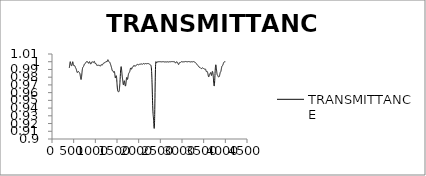
| Category | TRANSMITTANCE |
|---|---|
| 3999.640137 | 1 |
| 3997.71167 | 1 |
| 3995.783203 | 1 |
| 3993.854736 | 1 |
| 3991.92627 | 1 |
| 3989.997803 | 1 |
| 3988.069336 | 1 |
| 3986.140869 | 1 |
| 3984.212402 | 1 |
| 3982.283936 | 1 |
| 3980.355469 | 1 |
| 3978.427002 | 1 |
| 3976.498535 | 1 |
| 3974.570068 | 1 |
| 3972.641602 | 1 |
| 3970.713135 | 1 |
| 3968.784668 | 0.999 |
| 3966.856201 | 0.999 |
| 3964.927734 | 0.999 |
| 3962.999268 | 0.999 |
| 3961.070801 | 0.999 |
| 3959.142334 | 0.998 |
| 3957.213867 | 0.998 |
| 3955.2854 | 0.998 |
| 3953.356934 | 0.997 |
| 3951.428467 | 0.997 |
| 3949.5 | 0.997 |
| 3947.571533 | 0.997 |
| 3945.643066 | 0.996 |
| 3943.7146 | 0.996 |
| 3941.786133 | 0.996 |
| 3939.857666 | 0.995 |
| 3937.929199 | 0.995 |
| 3936.000732 | 0.995 |
| 3934.072266 | 0.995 |
| 3932.143799 | 0.995 |
| 3930.215332 | 0.995 |
| 3928.286865 | 0.995 |
| 3926.358398 | 0.995 |
| 3924.429932 | 0.994 |
| 3922.501465 | 0.994 |
| 3920.572998 | 0.994 |
| 3918.644531 | 0.994 |
| 3916.716064 | 0.993 |
| 3914.787598 | 0.993 |
| 3912.859131 | 0.992 |
| 3910.930664 | 0.992 |
| 3909.002197 | 0.991 |
| 3907.07373 | 0.99 |
| 3905.145264 | 0.99 |
| 3903.216797 | 0.989 |
| 3901.28833 | 0.989 |
| 3899.359863 | 0.988 |
| 3897.431396 | 0.988 |
| 3895.50293 | 0.987 |
| 3893.574463 | 0.987 |
| 3891.645996 | 0.987 |
| 3889.717529 | 0.987 |
| 3887.789063 | 0.987 |
| 3885.860596 | 0.987 |
| 3883.932129 | 0.986 |
| 3882.003662 | 0.986 |
| 3880.075195 | 0.986 |
| 3878.146729 | 0.985 |
| 3876.218262 | 0.985 |
| 3874.289795 | 0.984 |
| 3872.361328 | 0.984 |
| 3870.432861 | 0.983 |
| 3868.504395 | 0.982 |
| 3866.575928 | 0.982 |
| 3864.647461 | 0.981 |
| 3862.718994 | 0.981 |
| 3860.790527 | 0.981 |
| 3858.862061 | 0.981 |
| 3856.933594 | 0.981 |
| 3855.005127 | 0.98 |
| 3853.07666 | 0.98 |
| 3851.148193 | 0.98 |
| 3849.219727 | 0.98 |
| 3847.29126 | 0.98 |
| 3845.362793 | 0.98 |
| 3843.434326 | 0.98 |
| 3841.505859 | 0.98 |
| 3839.577393 | 0.981 |
| 3837.648926 | 0.981 |
| 3835.720459 | 0.981 |
| 3833.791992 | 0.981 |
| 3831.863525 | 0.981 |
| 3829.935059 | 0.981 |
| 3828.006592 | 0.981 |
| 3826.078125 | 0.982 |
| 3824.149658 | 0.982 |
| 3822.221191 | 0.982 |
| 3820.292725 | 0.983 |
| 3818.364258 | 0.983 |
| 3816.435791 | 0.983 |
| 3814.507324 | 0.983 |
| 3812.578857 | 0.983 |
| 3810.650391 | 0.984 |
| 3808.721924 | 0.984 |
| 3806.793457 | 0.985 |
| 3804.86499 | 0.986 |
| 3802.936523 | 0.986 |
| 3801.008057 | 0.987 |
| 3799.07959 | 0.988 |
| 3797.151123 | 0.989 |
| 3795.222656 | 0.99 |
| 3793.294189 | 0.991 |
| 3791.365723 | 0.992 |
| 3789.437256 | 0.994 |
| 3787.508789 | 0.994 |
| 3785.580322 | 0.995 |
| 3783.651855 | 0.996 |
| 3781.723389 | 0.996 |
| 3779.794922 | 0.996 |
| 3777.866455 | 0.996 |
| 3775.937988 | 0.995 |
| 3774.009521 | 0.994 |
| 3772.081055 | 0.993 |
| 3770.152588 | 0.992 |
| 3768.224121 | 0.991 |
| 3766.295654 | 0.989 |
| 3764.367188 | 0.987 |
| 3762.438721 | 0.985 |
| 3760.510254 | 0.982 |
| 3758.581787 | 0.98 |
| 3756.65332 | 0.978 |
| 3754.724854 | 0.976 |
| 3752.796387 | 0.974 |
| 3750.86792 | 0.972 |
| 3748.939453 | 0.971 |
| 3747.010986 | 0.97 |
| 3745.08252 | 0.969 |
| 3743.154053 | 0.969 |
| 3741.225586 | 0.969 |
| 3739.297119 | 0.969 |
| 3737.368652 | 0.97 |
| 3735.440186 | 0.971 |
| 3733.511719 | 0.972 |
| 3731.583252 | 0.974 |
| 3729.654785 | 0.975 |
| 3727.726318 | 0.977 |
| 3725.797852 | 0.978 |
| 3723.869385 | 0.979 |
| 3721.940918 | 0.981 |
| 3720.012451 | 0.982 |
| 3718.083984 | 0.983 |
| 3716.155518 | 0.984 |
| 3714.227051 | 0.985 |
| 3712.298584 | 0.986 |
| 3710.370117 | 0.986 |
| 3708.44165 | 0.987 |
| 3706.513184 | 0.987 |
| 3704.584717 | 0.987 |
| 3702.65625 | 0.988 |
| 3700.727783 | 0.987 |
| 3698.799316 | 0.987 |
| 3696.87085 | 0.987 |
| 3694.942383 | 0.986 |
| 3693.013916 | 0.986 |
| 3691.085449 | 0.985 |
| 3689.156982 | 0.984 |
| 3687.228516 | 0.984 |
| 3685.300049 | 0.983 |
| 3683.371582 | 0.983 |
| 3681.443115 | 0.982 |
| 3679.514648 | 0.982 |
| 3677.586182 | 0.982 |
| 3675.657715 | 0.983 |
| 3673.729248 | 0.983 |
| 3671.800781 | 0.984 |
| 3669.872314 | 0.984 |
| 3667.943848 | 0.985 |
| 3666.015381 | 0.985 |
| 3664.086914 | 0.986 |
| 3662.158447 | 0.986 |
| 3660.22998 | 0.986 |
| 3658.301514 | 0.986 |
| 3656.373047 | 0.986 |
| 3654.44458 | 0.986 |
| 3652.516113 | 0.985 |
| 3650.587646 | 0.985 |
| 3648.65918 | 0.985 |
| 3646.730713 | 0.985 |
| 3644.802246 | 0.984 |
| 3642.873779 | 0.984 |
| 3640.945313 | 0.984 |
| 3639.016846 | 0.984 |
| 3637.088379 | 0.984 |
| 3635.159912 | 0.984 |
| 3633.231445 | 0.983 |
| 3631.302979 | 0.983 |
| 3629.374512 | 0.983 |
| 3627.446045 | 0.982 |
| 3625.517578 | 0.982 |
| 3623.589111 | 0.981 |
| 3621.660645 | 0.981 |
| 3619.732178 | 0.981 |
| 3617.803711 | 0.98 |
| 3615.875244 | 0.98 |
| 3613.946777 | 0.981 |
| 3612.018311 | 0.981 |
| 3610.089844 | 0.981 |
| 3608.161377 | 0.982 |
| 3606.23291 | 0.982 |
| 3604.304443 | 0.983 |
| 3602.375977 | 0.983 |
| 3600.44751 | 0.984 |
| 3598.519043 | 0.984 |
| 3596.590576 | 0.985 |
| 3594.662109 | 0.985 |
| 3592.733643 | 0.986 |
| 3590.805176 | 0.986 |
| 3588.876709 | 0.987 |
| 3586.948242 | 0.987 |
| 3585.019775 | 0.987 |
| 3583.091309 | 0.987 |
| 3581.162842 | 0.987 |
| 3579.234375 | 0.988 |
| 3577.305908 | 0.988 |
| 3575.377441 | 0.987 |
| 3573.448975 | 0.987 |
| 3571.520508 | 0.987 |
| 3569.592041 | 0.987 |
| 3567.663574 | 0.987 |
| 3565.735107 | 0.987 |
| 3563.806641 | 0.987 |
| 3561.878174 | 0.987 |
| 3559.949707 | 0.987 |
| 3558.02124 | 0.988 |
| 3556.092773 | 0.988 |
| 3554.164307 | 0.988 |
| 3552.23584 | 0.989 |
| 3550.307373 | 0.989 |
| 3548.378906 | 0.99 |
| 3546.450439 | 0.99 |
| 3544.521973 | 0.99 |
| 3542.593506 | 0.99 |
| 3540.665039 | 0.99 |
| 3538.736572 | 0.991 |
| 3536.808105 | 0.991 |
| 3534.879639 | 0.991 |
| 3532.951172 | 0.991 |
| 3531.022705 | 0.991 |
| 3529.094238 | 0.991 |
| 3527.165771 | 0.991 |
| 3525.237305 | 0.991 |
| 3523.308838 | 0.991 |
| 3521.380371 | 0.991 |
| 3519.451904 | 0.991 |
| 3517.523438 | 0.991 |
| 3515.594971 | 0.991 |
| 3513.666504 | 0.991 |
| 3511.738037 | 0.991 |
| 3509.80957 | 0.991 |
| 3507.881104 | 0.991 |
| 3505.952637 | 0.991 |
| 3504.02417 | 0.991 |
| 3502.095703 | 0.991 |
| 3500.167236 | 0.991 |
| 3498.23877 | 0.991 |
| 3496.310303 | 0.991 |
| 3494.381836 | 0.991 |
| 3492.453369 | 0.991 |
| 3490.524902 | 0.991 |
| 3488.596436 | 0.991 |
| 3486.667969 | 0.992 |
| 3484.739502 | 0.992 |
| 3482.811035 | 0.992 |
| 3480.882568 | 0.992 |
| 3478.954102 | 0.992 |
| 3477.025635 | 0.992 |
| 3475.097168 | 0.992 |
| 3473.168701 | 0.992 |
| 3471.240234 | 0.992 |
| 3469.311768 | 0.992 |
| 3467.383301 | 0.992 |
| 3465.454834 | 0.992 |
| 3463.526367 | 0.992 |
| 3461.5979 | 0.992 |
| 3459.669434 | 0.992 |
| 3457.740967 | 0.992 |
| 3455.8125 | 0.992 |
| 3453.884033 | 0.991 |
| 3451.955566 | 0.991 |
| 3450.0271 | 0.991 |
| 3448.098633 | 0.991 |
| 3446.170166 | 0.991 |
| 3444.241699 | 0.991 |
| 3442.313232 | 0.991 |
| 3440.384766 | 0.991 |
| 3438.456299 | 0.991 |
| 3436.527832 | 0.991 |
| 3434.599365 | 0.991 |
| 3432.670898 | 0.992 |
| 3430.742432 | 0.992 |
| 3428.813965 | 0.992 |
| 3426.885498 | 0.992 |
| 3424.957031 | 0.992 |
| 3423.028564 | 0.992 |
| 3421.100098 | 0.992 |
| 3419.171631 | 0.993 |
| 3417.243164 | 0.993 |
| 3415.314697 | 0.993 |
| 3413.38623 | 0.993 |
| 3411.457764 | 0.993 |
| 3409.529297 | 0.993 |
| 3407.60083 | 0.993 |
| 3405.672363 | 0.993 |
| 3403.743896 | 0.993 |
| 3401.81543 | 0.993 |
| 3399.886963 | 0.993 |
| 3397.958496 | 0.993 |
| 3396.030029 | 0.993 |
| 3394.101563 | 0.993 |
| 3392.173096 | 0.993 |
| 3390.244629 | 0.993 |
| 3388.316162 | 0.993 |
| 3386.387695 | 0.993 |
| 3384.459229 | 0.994 |
| 3382.530762 | 0.994 |
| 3380.602295 | 0.994 |
| 3378.673828 | 0.994 |
| 3376.745361 | 0.994 |
| 3374.816895 | 0.995 |
| 3372.888428 | 0.995 |
| 3370.959961 | 0.995 |
| 3369.031494 | 0.995 |
| 3367.103027 | 0.995 |
| 3365.174561 | 0.995 |
| 3363.246094 | 0.995 |
| 3361.317627 | 0.995 |
| 3359.38916 | 0.996 |
| 3357.460693 | 0.996 |
| 3355.532227 | 0.996 |
| 3353.60376 | 0.996 |
| 3351.675293 | 0.996 |
| 3349.746826 | 0.996 |
| 3347.818359 | 0.996 |
| 3345.889893 | 0.996 |
| 3343.961426 | 0.997 |
| 3342.032959 | 0.997 |
| 3340.104492 | 0.997 |
| 3338.176025 | 0.997 |
| 3336.247559 | 0.997 |
| 3334.319092 | 0.997 |
| 3332.390625 | 0.997 |
| 3330.462158 | 0.998 |
| 3328.533691 | 0.998 |
| 3326.605225 | 0.998 |
| 3324.676758 | 0.998 |
| 3322.748291 | 0.998 |
| 3320.819824 | 0.998 |
| 3318.891357 | 0.998 |
| 3316.962891 | 0.999 |
| 3315.034424 | 0.999 |
| 3313.105957 | 0.999 |
| 3311.17749 | 0.999 |
| 3309.249023 | 0.999 |
| 3307.320557 | 0.999 |
| 3305.39209 | 0.999 |
| 3303.463623 | 0.999 |
| 3301.535156 | 0.999 |
| 3299.606689 | 0.999 |
| 3297.678223 | 0.999 |
| 3295.749756 | 1 |
| 3293.821289 | 1 |
| 3291.892822 | 1 |
| 3289.964355 | 1 |
| 3288.035889 | 1 |
| 3286.107422 | 1 |
| 3284.178955 | 1 |
| 3282.250488 | 1 |
| 3280.322021 | 1 |
| 3278.393555 | 1 |
| 3276.465088 | 1 |
| 3274.536621 | 1 |
| 3272.608154 | 1 |
| 3270.679688 | 1 |
| 3268.751221 | 1 |
| 3266.822754 | 1 |
| 3264.894287 | 1 |
| 3262.96582 | 1 |
| 3261.037354 | 1 |
| 3259.108887 | 1 |
| 3257.18042 | 1 |
| 3255.251953 | 1 |
| 3253.323486 | 1 |
| 3251.39502 | 1 |
| 3249.466553 | 1 |
| 3247.538086 | 1 |
| 3245.609619 | 1 |
| 3243.681152 | 1 |
| 3241.752686 | 1 |
| 3239.824219 | 1 |
| 3237.895752 | 1 |
| 3235.967285 | 1 |
| 3234.038818 | 1 |
| 3232.110352 | 1 |
| 3230.181885 | 1 |
| 3228.253418 | 1 |
| 3226.324951 | 1 |
| 3224.396484 | 1 |
| 3222.468018 | 1 |
| 3220.539551 | 1 |
| 3218.611084 | 1 |
| 3216.682617 | 1 |
| 3214.75415 | 1 |
| 3212.825684 | 1 |
| 3210.897217 | 1 |
| 3208.96875 | 1 |
| 3207.040283 | 1 |
| 3205.111816 | 1 |
| 3203.18335 | 1 |
| 3201.254883 | 1 |
| 3199.326416 | 1 |
| 3197.397949 | 1 |
| 3195.469482 | 1 |
| 3193.541016 | 1 |
| 3191.612549 | 1 |
| 3189.684082 | 1 |
| 3187.755615 | 1 |
| 3185.827148 | 1 |
| 3183.898682 | 1 |
| 3181.970215 | 1 |
| 3180.041748 | 1 |
| 3178.113281 | 1 |
| 3176.184814 | 1 |
| 3174.256348 | 1 |
| 3172.327881 | 1 |
| 3170.399414 | 1 |
| 3168.470947 | 1 |
| 3166.54248 | 1 |
| 3164.614014 | 1 |
| 3162.685547 | 1 |
| 3160.75708 | 1 |
| 3158.828613 | 1 |
| 3156.900146 | 1 |
| 3154.97168 | 1 |
| 3153.043213 | 1 |
| 3151.114746 | 1 |
| 3149.186279 | 1 |
| 3147.257813 | 1 |
| 3145.329346 | 1 |
| 3143.400879 | 1 |
| 3141.472412 | 1 |
| 3139.543945 | 1 |
| 3137.615479 | 1 |
| 3135.687012 | 1 |
| 3133.758545 | 1 |
| 3131.830078 | 1 |
| 3129.901611 | 1 |
| 3127.973145 | 1 |
| 3126.044678 | 1 |
| 3124.116211 | 1 |
| 3122.187744 | 1 |
| 3120.259277 | 1 |
| 3118.330811 | 1 |
| 3116.402344 | 1 |
| 3114.473877 | 1 |
| 3112.54541 | 1 |
| 3110.616943 | 1 |
| 3108.688477 | 1 |
| 3106.76001 | 1 |
| 3104.831543 | 1 |
| 3102.903076 | 1 |
| 3100.974609 | 1 |
| 3099.046143 | 1 |
| 3097.117676 | 1 |
| 3095.189209 | 1 |
| 3093.260742 | 1 |
| 3091.332275 | 1 |
| 3089.403809 | 1 |
| 3087.475342 | 1 |
| 3085.546875 | 1 |
| 3083.618408 | 1 |
| 3081.689941 | 1 |
| 3079.761475 | 1 |
| 3077.833008 | 1 |
| 3075.904541 | 1 |
| 3073.976074 | 1 |
| 3072.047607 | 1 |
| 3070.119141 | 1 |
| 3068.190674 | 1 |
| 3066.262207 | 1 |
| 3064.33374 | 1 |
| 3062.405273 | 1 |
| 3060.476807 | 1 |
| 3058.54834 | 1 |
| 3056.619873 | 1 |
| 3054.691406 | 1 |
| 3052.762939 | 1 |
| 3050.834473 | 1 |
| 3048.906006 | 1 |
| 3046.977539 | 1 |
| 3045.049072 | 1 |
| 3043.120605 | 1 |
| 3041.192139 | 1 |
| 3039.263672 | 1 |
| 3037.335205 | 1 |
| 3035.406738 | 1 |
| 3033.478271 | 1 |
| 3031.549805 | 1 |
| 3029.621338 | 1 |
| 3027.692871 | 1 |
| 3025.764404 | 1 |
| 3023.835938 | 1 |
| 3021.907471 | 1 |
| 3019.979004 | 1 |
| 3018.050537 | 1 |
| 3016.12207 | 1 |
| 3014.193604 | 1 |
| 3012.265137 | 1 |
| 3010.33667 | 1 |
| 3008.408203 | 1 |
| 3006.479736 | 1 |
| 3004.55127 | 1 |
| 3002.622803 | 1 |
| 3000.694336 | 1 |
| 2998.765869 | 1 |
| 2996.837402 | 1 |
| 2994.908936 | 1 |
| 2992.980469 | 1 |
| 2991.052002 | 1 |
| 2989.123535 | 1 |
| 2987.195068 | 1 |
| 2985.266602 | 1 |
| 2983.338135 | 1 |
| 2981.409668 | 1 |
| 2979.481201 | 1 |
| 2977.552734 | 1 |
| 2975.624268 | 1 |
| 2973.695801 | 1 |
| 2971.767334 | 0.999 |
| 2969.838867 | 0.999 |
| 2967.9104 | 0.999 |
| 2965.981934 | 0.999 |
| 2964.053467 | 0.999 |
| 2962.125 | 0.999 |
| 2960.196533 | 0.999 |
| 2958.268066 | 0.999 |
| 2956.3396 | 0.999 |
| 2954.411133 | 0.999 |
| 2952.482666 | 0.999 |
| 2950.554199 | 0.999 |
| 2948.625732 | 0.999 |
| 2946.697266 | 0.999 |
| 2944.768799 | 0.999 |
| 2942.840332 | 0.999 |
| 2940.911865 | 0.999 |
| 2938.983398 | 0.998 |
| 2937.054932 | 0.998 |
| 2935.126465 | 0.998 |
| 2933.197998 | 0.998 |
| 2931.269531 | 0.997 |
| 2929.341064 | 0.997 |
| 2927.412598 | 0.997 |
| 2925.484131 | 0.997 |
| 2923.555664 | 0.996 |
| 2921.627197 | 0.996 |
| 2919.69873 | 0.996 |
| 2917.770264 | 0.996 |
| 2915.841797 | 0.997 |
| 2913.91333 | 0.997 |
| 2911.984863 | 0.997 |
| 2910.056396 | 0.997 |
| 2908.12793 | 0.998 |
| 2906.199463 | 0.998 |
| 2904.270996 | 0.998 |
| 2902.342529 | 0.998 |
| 2900.414063 | 0.999 |
| 2898.485596 | 0.999 |
| 2896.557129 | 0.999 |
| 2894.628662 | 0.999 |
| 2892.700195 | 0.999 |
| 2890.771729 | 1 |
| 2888.843262 | 1 |
| 2886.914795 | 1 |
| 2884.986328 | 1 |
| 2883.057861 | 1 |
| 2881.129395 | 1 |
| 2879.200928 | 1 |
| 2877.272461 | 1 |
| 2875.343994 | 1 |
| 2873.415527 | 1 |
| 2871.487061 | 1 |
| 2869.558594 | 1 |
| 2867.630127 | 0.999 |
| 2865.70166 | 0.999 |
| 2863.773193 | 0.999 |
| 2861.844727 | 0.999 |
| 2859.91626 | 0.999 |
| 2857.987793 | 0.998 |
| 2856.059326 | 0.998 |
| 2854.130859 | 0.998 |
| 2852.202393 | 0.998 |
| 2850.273926 | 0.998 |
| 2848.345459 | 0.998 |
| 2846.416992 | 0.998 |
| 2844.488525 | 0.999 |
| 2842.560059 | 0.999 |
| 2840.631592 | 0.999 |
| 2838.703125 | 0.999 |
| 2836.774658 | 0.999 |
| 2834.846191 | 1 |
| 2832.917725 | 1 |
| 2830.989258 | 1 |
| 2829.060791 | 1 |
| 2827.132324 | 1 |
| 2825.203857 | 1 |
| 2823.275391 | 1 |
| 2821.346924 | 1 |
| 2819.418457 | 1 |
| 2817.48999 | 1 |
| 2815.561523 | 1 |
| 2813.633057 | 1 |
| 2811.70459 | 1 |
| 2809.776123 | 1 |
| 2807.847656 | 1 |
| 2805.919189 | 1 |
| 2803.990723 | 1 |
| 2802.062256 | 1 |
| 2800.133789 | 1 |
| 2798.205322 | 1 |
| 2796.276855 | 1 |
| 2794.348389 | 1 |
| 2792.419922 | 1 |
| 2790.491455 | 1 |
| 2788.562988 | 1 |
| 2786.634521 | 1 |
| 2784.706055 | 1 |
| 2782.777588 | 1 |
| 2780.849121 | 1 |
| 2778.920654 | 1 |
| 2776.992188 | 1 |
| 2775.063721 | 1 |
| 2773.135254 | 1 |
| 2771.206787 | 1 |
| 2769.27832 | 1 |
| 2767.349854 | 1 |
| 2765.421387 | 1 |
| 2763.49292 | 1 |
| 2761.564453 | 1 |
| 2759.635986 | 1 |
| 2757.70752 | 1 |
| 2755.779053 | 1 |
| 2753.850586 | 1 |
| 2751.922119 | 1 |
| 2749.993652 | 1 |
| 2748.065186 | 1 |
| 2746.136719 | 1 |
| 2744.208252 | 1 |
| 2742.279785 | 1 |
| 2740.351318 | 1 |
| 2738.422852 | 1 |
| 2736.494385 | 1 |
| 2734.565918 | 1 |
| 2732.637451 | 1 |
| 2730.708984 | 1 |
| 2728.780518 | 1 |
| 2726.852051 | 1 |
| 2724.923584 | 1 |
| 2722.995117 | 1 |
| 2721.06665 | 1 |
| 2719.138184 | 1 |
| 2717.209717 | 1 |
| 2715.28125 | 1 |
| 2713.352783 | 1 |
| 2711.424316 | 1 |
| 2709.49585 | 1 |
| 2707.567383 | 1 |
| 2705.638916 | 1 |
| 2703.710449 | 1 |
| 2701.781982 | 1 |
| 2699.853516 | 1 |
| 2697.925049 | 1 |
| 2695.996582 | 1 |
| 2694.068115 | 1 |
| 2692.139648 | 1 |
| 2690.211182 | 1 |
| 2688.282715 | 1 |
| 2686.354248 | 1 |
| 2684.425781 | 1 |
| 2682.497314 | 1 |
| 2680.568848 | 1 |
| 2678.640381 | 1 |
| 2676.711914 | 1 |
| 2674.783447 | 1 |
| 2672.85498 | 1 |
| 2670.926514 | 1 |
| 2668.998047 | 1 |
| 2667.06958 | 1 |
| 2665.141113 | 1 |
| 2663.212646 | 1 |
| 2661.28418 | 1 |
| 2659.355713 | 1 |
| 2657.427246 | 1 |
| 2655.498779 | 1 |
| 2653.570313 | 1 |
| 2651.641846 | 1 |
| 2649.713379 | 1 |
| 2647.784912 | 1 |
| 2645.856445 | 1 |
| 2643.927979 | 1 |
| 2641.999512 | 1 |
| 2640.071045 | 1 |
| 2638.142578 | 1 |
| 2636.214111 | 1 |
| 2634.285645 | 1 |
| 2632.357178 | 1 |
| 2630.428711 | 1 |
| 2628.500244 | 1 |
| 2626.571777 | 1 |
| 2624.643311 | 1 |
| 2622.714844 | 1 |
| 2620.786377 | 1 |
| 2618.85791 | 1 |
| 2616.929443 | 1 |
| 2615.000977 | 1 |
| 2613.07251 | 1 |
| 2611.144043 | 1 |
| 2609.215576 | 1 |
| 2607.287109 | 1 |
| 2605.358643 | 1 |
| 2603.430176 | 1 |
| 2601.501709 | 1 |
| 2599.573242 | 1 |
| 2597.644775 | 1 |
| 2595.716309 | 1 |
| 2593.787842 | 1 |
| 2591.859375 | 1 |
| 2589.930908 | 1 |
| 2588.002441 | 1 |
| 2586.073975 | 1 |
| 2584.145508 | 1 |
| 2582.217041 | 1 |
| 2580.288574 | 1 |
| 2578.360107 | 1 |
| 2576.431641 | 1 |
| 2574.503174 | 1 |
| 2572.574707 | 1 |
| 2570.64624 | 1 |
| 2568.717773 | 1 |
| 2566.789307 | 1 |
| 2564.86084 | 1 |
| 2562.932373 | 1 |
| 2561.003906 | 1 |
| 2559.075439 | 1 |
| 2557.146973 | 1 |
| 2555.218506 | 1 |
| 2553.290039 | 1 |
| 2551.361572 | 1 |
| 2549.433105 | 1 |
| 2547.504639 | 1 |
| 2545.576172 | 1 |
| 2543.647705 | 1 |
| 2541.719238 | 1 |
| 2539.790771 | 1 |
| 2537.862305 | 1 |
| 2535.933838 | 1 |
| 2534.005371 | 1 |
| 2532.076904 | 1 |
| 2530.148438 | 1 |
| 2528.219971 | 1 |
| 2526.291504 | 1 |
| 2524.363037 | 1 |
| 2522.43457 | 1 |
| 2520.506104 | 1 |
| 2518.577637 | 1 |
| 2516.64917 | 1 |
| 2514.720703 | 1 |
| 2512.792236 | 1 |
| 2510.86377 | 1 |
| 2508.935303 | 1 |
| 2507.006836 | 1 |
| 2505.078369 | 1 |
| 2503.149902 | 1 |
| 2501.221436 | 1 |
| 2499.292969 | 1 |
| 2497.364502 | 1 |
| 2495.436035 | 1 |
| 2493.507568 | 1 |
| 2491.579102 | 1 |
| 2489.650635 | 1 |
| 2487.722168 | 1 |
| 2485.793701 | 1 |
| 2483.865234 | 1 |
| 2481.936768 | 1 |
| 2480.008301 | 1 |
| 2478.079834 | 1 |
| 2476.151367 | 1 |
| 2474.2229 | 1 |
| 2472.294434 | 1 |
| 2470.365967 | 1 |
| 2468.4375 | 1 |
| 2466.509033 | 1 |
| 2464.580566 | 1 |
| 2462.6521 | 1 |
| 2460.723633 | 1 |
| 2458.795166 | 1 |
| 2456.866699 | 1 |
| 2454.938232 | 1 |
| 2453.009766 | 1 |
| 2451.081299 | 1 |
| 2449.152832 | 1 |
| 2447.224365 | 1 |
| 2445.295898 | 1 |
| 2443.367432 | 1 |
| 2441.438965 | 1 |
| 2439.510498 | 1 |
| 2437.582031 | 1 |
| 2435.653564 | 1 |
| 2433.725098 | 1 |
| 2431.796631 | 1 |
| 2429.868164 | 1 |
| 2427.939697 | 0.999 |
| 2426.01123 | 0.999 |
| 2424.082764 | 0.999 |
| 2422.154297 | 0.999 |
| 2420.22583 | 0.999 |
| 2418.297363 | 0.999 |
| 2416.368896 | 0.998 |
| 2414.44043 | 0.998 |
| 2412.511963 | 0.999 |
| 2410.583496 | 0.999 |
| 2408.655029 | 0.999 |
| 2406.726563 | 0.999 |
| 2404.798096 | 1 |
| 2402.869629 | 1 |
| 2400.941162 | 1 |
| 2399.012695 | 1 |
| 2397.084229 | 1 |
| 2395.155762 | 0.999 |
| 2393.227295 | 0.998 |
| 2391.298828 | 0.996 |
| 2389.370361 | 0.994 |
| 2387.441895 | 0.99 |
| 2385.513428 | 0.985 |
| 2383.584961 | 0.98 |
| 2381.656494 | 0.974 |
| 2379.728027 | 0.967 |
| 2377.799561 | 0.96 |
| 2375.871094 | 0.953 |
| 2373.942627 | 0.945 |
| 2372.01416 | 0.938 |
| 2370.085693 | 0.932 |
| 2368.157227 | 0.926 |
| 2366.22876 | 0.922 |
| 2364.300293 | 0.918 |
| 2362.371826 | 0.915 |
| 2360.443359 | 0.914 |
| 2358.514893 | 0.914 |
| 2356.586426 | 0.914 |
| 2354.657959 | 0.915 |
| 2352.729492 | 0.917 |
| 2350.801025 | 0.918 |
| 2348.872559 | 0.92 |
| 2346.944092 | 0.922 |
| 2345.015625 | 0.924 |
| 2343.087158 | 0.926 |
| 2341.158691 | 0.927 |
| 2339.230225 | 0.928 |
| 2337.301758 | 0.929 |
| 2335.373291 | 0.931 |
| 2333.444824 | 0.932 |
| 2331.516357 | 0.933 |
| 2329.587891 | 0.935 |
| 2327.659424 | 0.937 |
| 2325.730957 | 0.94 |
| 2323.80249 | 0.943 |
| 2321.874023 | 0.946 |
| 2319.945557 | 0.95 |
| 2318.01709 | 0.954 |
| 2316.088623 | 0.958 |
| 2314.160156 | 0.962 |
| 2312.231689 | 0.966 |
| 2310.303223 | 0.97 |
| 2308.374756 | 0.974 |
| 2306.446289 | 0.977 |
| 2304.517822 | 0.98 |
| 2302.589355 | 0.983 |
| 2300.660889 | 0.985 |
| 2298.732422 | 0.987 |
| 2296.803955 | 0.989 |
| 2294.875488 | 0.991 |
| 2292.947021 | 0.992 |
| 2291.018555 | 0.993 |
| 2289.090088 | 0.994 |
| 2287.161621 | 0.994 |
| 2285.233154 | 0.995 |
| 2283.304688 | 0.995 |
| 2281.376221 | 0.995 |
| 2279.447754 | 0.996 |
| 2277.519287 | 0.996 |
| 2275.59082 | 0.996 |
| 2273.662354 | 0.996 |
| 2271.733887 | 0.996 |
| 2269.80542 | 0.996 |
| 2267.876953 | 0.996 |
| 2265.948486 | 0.996 |
| 2264.02002 | 0.996 |
| 2262.091553 | 0.996 |
| 2260.163086 | 0.996 |
| 2258.234619 | 0.996 |
| 2256.306152 | 0.997 |
| 2254.377686 | 0.997 |
| 2252.449219 | 0.997 |
| 2250.520752 | 0.997 |
| 2248.592285 | 0.997 |
| 2246.663818 | 0.997 |
| 2244.735352 | 0.997 |
| 2242.806885 | 0.997 |
| 2240.878418 | 0.997 |
| 2238.949951 | 0.997 |
| 2237.021484 | 0.997 |
| 2235.093018 | 0.997 |
| 2233.164551 | 0.997 |
| 2231.236084 | 0.997 |
| 2229.307617 | 0.997 |
| 2227.37915 | 0.998 |
| 2225.450684 | 0.998 |
| 2223.522217 | 0.998 |
| 2221.59375 | 0.998 |
| 2219.665283 | 0.998 |
| 2217.736816 | 0.998 |
| 2215.80835 | 0.998 |
| 2213.879883 | 0.998 |
| 2211.951416 | 0.998 |
| 2210.022949 | 0.998 |
| 2208.094482 | 0.998 |
| 2206.166016 | 0.998 |
| 2204.237549 | 0.998 |
| 2202.309082 | 0.998 |
| 2200.380615 | 0.998 |
| 2198.452148 | 0.997 |
| 2196.523682 | 0.997 |
| 2194.595215 | 0.997 |
| 2192.666748 | 0.997 |
| 2190.738281 | 0.997 |
| 2188.809814 | 0.997 |
| 2186.881348 | 0.997 |
| 2184.952881 | 0.997 |
| 2183.024414 | 0.997 |
| 2181.095947 | 0.997 |
| 2179.16748 | 0.997 |
| 2177.239014 | 0.997 |
| 2175.310547 | 0.998 |
| 2173.38208 | 0.998 |
| 2171.453613 | 0.998 |
| 2169.525146 | 0.998 |
| 2167.59668 | 0.998 |
| 2165.668213 | 0.998 |
| 2163.739746 | 0.998 |
| 2161.811279 | 0.998 |
| 2159.882813 | 0.998 |
| 2157.954346 | 0.998 |
| 2156.025879 | 0.998 |
| 2154.097412 | 0.998 |
| 2152.168945 | 0.998 |
| 2150.240479 | 0.998 |
| 2148.312012 | 0.997 |
| 2146.383545 | 0.997 |
| 2144.455078 | 0.997 |
| 2142.526611 | 0.997 |
| 2140.598145 | 0.997 |
| 2138.669678 | 0.997 |
| 2136.741211 | 0.997 |
| 2134.812744 | 0.997 |
| 2132.884277 | 0.997 |
| 2130.955811 | 0.997 |
| 2129.027344 | 0.997 |
| 2127.098877 | 0.997 |
| 2125.17041 | 0.997 |
| 2123.241943 | 0.997 |
| 2121.313477 | 0.997 |
| 2119.38501 | 0.997 |
| 2117.456543 | 0.997 |
| 2115.528076 | 0.997 |
| 2113.599609 | 0.998 |
| 2111.671143 | 0.998 |
| 2109.742676 | 0.998 |
| 2107.814209 | 0.998 |
| 2105.885742 | 0.998 |
| 2103.957275 | 0.998 |
| 2102.028809 | 0.998 |
| 2100.100342 | 0.997 |
| 2098.171875 | 0.997 |
| 2096.243408 | 0.997 |
| 2094.314941 | 0.997 |
| 2092.386475 | 0.997 |
| 2090.458008 | 0.997 |
| 2088.529541 | 0.997 |
| 2086.601074 | 0.997 |
| 2084.672607 | 0.997 |
| 2082.744141 | 0.997 |
| 2080.815674 | 0.997 |
| 2078.887207 | 0.997 |
| 2076.95874 | 0.997 |
| 2075.030273 | 0.997 |
| 2073.101807 | 0.997 |
| 2071.17334 | 0.997 |
| 2069.244873 | 0.997 |
| 2067.316406 | 0.997 |
| 2065.387939 | 0.997 |
| 2063.459473 | 0.997 |
| 2061.531006 | 0.997 |
| 2059.602539 | 0.997 |
| 2057.674072 | 0.997 |
| 2055.745605 | 0.997 |
| 2053.817139 | 0.997 |
| 2051.888672 | 0.997 |
| 2049.960205 | 0.997 |
| 2048.031738 | 0.997 |
| 2046.103271 | 0.997 |
| 2044.174805 | 0.997 |
| 2042.246338 | 0.997 |
| 2040.317871 | 0.997 |
| 2038.389404 | 0.997 |
| 2036.460938 | 0.997 |
| 2034.532471 | 0.997 |
| 2032.604004 | 0.997 |
| 2030.675537 | 0.997 |
| 2028.74707 | 0.997 |
| 2026.818604 | 0.997 |
| 2024.890137 | 0.997 |
| 2022.96167 | 0.997 |
| 2021.033203 | 0.997 |
| 2019.104736 | 0.997 |
| 2017.17627 | 0.997 |
| 2015.247803 | 0.997 |
| 2013.319336 | 0.997 |
| 2011.390869 | 0.997 |
| 2009.462402 | 0.996 |
| 2007.533936 | 0.996 |
| 2005.605469 | 0.996 |
| 2003.677002 | 0.996 |
| 2001.748535 | 0.996 |
| 1999.820068 | 0.996 |
| 1997.891602 | 0.996 |
| 1995.963135 | 0.996 |
| 1994.034668 | 0.996 |
| 1992.106201 | 0.996 |
| 1990.177734 | 0.996 |
| 1988.249268 | 0.996 |
| 1986.320801 | 0.996 |
| 1984.392334 | 0.996 |
| 1982.463867 | 0.996 |
| 1980.5354 | 0.996 |
| 1978.606934 | 0.996 |
| 1976.678467 | 0.996 |
| 1974.75 | 0.997 |
| 1972.821533 | 0.996 |
| 1970.893066 | 0.996 |
| 1968.9646 | 0.996 |
| 1967.036133 | 0.996 |
| 1965.107666 | 0.996 |
| 1963.179199 | 0.996 |
| 1961.250732 | 0.996 |
| 1959.322266 | 0.996 |
| 1957.393799 | 0.996 |
| 1955.465332 | 0.996 |
| 1953.536865 | 0.996 |
| 1951.608398 | 0.996 |
| 1949.679932 | 0.996 |
| 1947.751465 | 0.996 |
| 1945.822998 | 0.996 |
| 1943.894531 | 0.996 |
| 1941.966064 | 0.996 |
| 1940.037598 | 0.996 |
| 1938.109131 | 0.995 |
| 1936.180664 | 0.995 |
| 1934.252197 | 0.995 |
| 1932.32373 | 0.995 |
| 1930.395264 | 0.995 |
| 1928.466797 | 0.995 |
| 1926.53833 | 0.995 |
| 1924.609863 | 0.994 |
| 1922.681396 | 0.994 |
| 1920.75293 | 0.994 |
| 1918.824463 | 0.994 |
| 1916.895996 | 0.994 |
| 1914.967529 | 0.994 |
| 1913.039063 | 0.994 |
| 1911.110596 | 0.994 |
| 1909.182129 | 0.994 |
| 1907.253662 | 0.994 |
| 1905.325195 | 0.995 |
| 1903.396729 | 0.995 |
| 1901.468262 | 0.995 |
| 1899.539795 | 0.995 |
| 1897.611328 | 0.995 |
| 1895.682861 | 0.995 |
| 1893.754395 | 0.995 |
| 1891.825928 | 0.995 |
| 1889.897461 | 0.995 |
| 1887.968994 | 0.995 |
| 1886.040527 | 0.995 |
| 1884.112061 | 0.995 |
| 1882.183594 | 0.995 |
| 1880.255127 | 0.994 |
| 1878.32666 | 0.994 |
| 1876.398193 | 0.994 |
| 1874.469727 | 0.994 |
| 1872.54126 | 0.993 |
| 1870.612793 | 0.993 |
| 1868.684326 | 0.993 |
| 1866.755859 | 0.993 |
| 1864.827393 | 0.993 |
| 1862.898926 | 0.993 |
| 1860.970459 | 0.993 |
| 1859.041992 | 0.993 |
| 1857.113525 | 0.993 |
| 1855.185059 | 0.993 |
| 1853.256592 | 0.993 |
| 1851.328125 | 0.993 |
| 1849.399658 | 0.992 |
| 1847.471191 | 0.992 |
| 1845.542725 | 0.992 |
| 1843.614258 | 0.991 |
| 1841.685791 | 0.991 |
| 1839.757324 | 0.991 |
| 1837.828857 | 0.99 |
| 1835.900391 | 0.99 |
| 1833.971924 | 0.99 |
| 1832.043457 | 0.99 |
| 1830.11499 | 0.991 |
| 1828.186523 | 0.991 |
| 1826.258057 | 0.991 |
| 1824.32959 | 0.991 |
| 1822.401123 | 0.992 |
| 1820.472656 | 0.992 |
| 1818.544189 | 0.992 |
| 1816.615723 | 0.992 |
| 1814.687256 | 0.992 |
| 1812.758789 | 0.992 |
| 1810.830322 | 0.991 |
| 1808.901855 | 0.991 |
| 1806.973389 | 0.99 |
| 1805.044922 | 0.99 |
| 1803.116455 | 0.989 |
| 1801.187988 | 0.989 |
| 1799.259521 | 0.988 |
| 1797.331055 | 0.988 |
| 1795.402588 | 0.988 |
| 1793.474121 | 0.987 |
| 1791.545654 | 0.987 |
| 1789.617188 | 0.987 |
| 1787.688721 | 0.987 |
| 1785.760254 | 0.986 |
| 1783.831787 | 0.986 |
| 1781.90332 | 0.986 |
| 1779.974854 | 0.986 |
| 1778.046387 | 0.986 |
| 1776.11792 | 0.985 |
| 1774.189453 | 0.985 |
| 1772.260986 | 0.985 |
| 1770.33252 | 0.985 |
| 1768.404053 | 0.985 |
| 1766.475586 | 0.984 |
| 1764.547119 | 0.984 |
| 1762.618652 | 0.983 |
| 1760.690186 | 0.983 |
| 1758.761719 | 0.982 |
| 1756.833252 | 0.981 |
| 1754.904785 | 0.981 |
| 1752.976318 | 0.98 |
| 1751.047852 | 0.979 |
| 1749.119385 | 0.978 |
| 1747.190918 | 0.978 |
| 1745.262451 | 0.977 |
| 1743.333984 | 0.977 |
| 1741.405518 | 0.977 |
| 1739.477051 | 0.977 |
| 1737.548584 | 0.978 |
| 1735.620117 | 0.978 |
| 1733.69165 | 0.978 |
| 1731.763184 | 0.979 |
| 1729.834717 | 0.979 |
| 1727.90625 | 0.98 |
| 1725.977783 | 0.98 |
| 1724.049316 | 0.98 |
| 1722.12085 | 0.979 |
| 1720.192383 | 0.979 |
| 1718.263916 | 0.978 |
| 1716.335449 | 0.978 |
| 1714.406982 | 0.976 |
| 1712.478516 | 0.975 |
| 1710.550049 | 0.974 |
| 1708.621582 | 0.973 |
| 1706.693115 | 0.972 |
| 1704.764648 | 0.971 |
| 1702.836182 | 0.97 |
| 1700.907715 | 0.97 |
| 1698.979248 | 0.969 |
| 1697.050781 | 0.969 |
| 1695.122314 | 0.968 |
| 1693.193848 | 0.968 |
| 1691.265381 | 0.969 |
| 1689.336914 | 0.969 |
| 1687.408447 | 0.97 |
| 1685.47998 | 0.97 |
| 1683.551514 | 0.971 |
| 1681.623047 | 0.972 |
| 1679.69458 | 0.973 |
| 1677.766113 | 0.973 |
| 1675.837646 | 0.974 |
| 1673.90918 | 0.975 |
| 1671.980713 | 0.975 |
| 1670.052246 | 0.975 |
| 1668.123779 | 0.975 |
| 1666.195313 | 0.975 |
| 1664.266846 | 0.975 |
| 1662.338379 | 0.974 |
| 1660.409912 | 0.973 |
| 1658.481445 | 0.973 |
| 1656.552979 | 0.972 |
| 1654.624512 | 0.971 |
| 1652.696045 | 0.971 |
| 1650.767578 | 0.97 |
| 1648.839111 | 0.97 |
| 1646.910645 | 0.97 |
| 1644.982178 | 0.97 |
| 1643.053711 | 0.971 |
| 1641.125244 | 0.972 |
| 1639.196777 | 0.972 |
| 1637.268311 | 0.973 |
| 1635.339844 | 0.974 |
| 1633.411377 | 0.975 |
| 1631.48291 | 0.976 |
| 1629.554443 | 0.977 |
| 1627.625977 | 0.978 |
| 1625.69751 | 0.979 |
| 1623.769043 | 0.98 |
| 1621.840576 | 0.981 |
| 1619.912109 | 0.982 |
| 1617.983643 | 0.983 |
| 1616.055176 | 0.984 |
| 1614.126709 | 0.985 |
| 1612.198242 | 0.986 |
| 1610.269775 | 0.987 |
| 1608.341309 | 0.988 |
| 1606.412842 | 0.99 |
| 1604.484375 | 0.991 |
| 1602.555908 | 0.992 |
| 1600.627441 | 0.993 |
| 1598.698975 | 0.993 |
| 1596.770508 | 0.994 |
| 1594.842041 | 0.994 |
| 1592.913574 | 0.993 |
| 1590.985107 | 0.993 |
| 1589.056641 | 0.992 |
| 1587.128174 | 0.991 |
| 1585.199707 | 0.99 |
| 1583.27124 | 0.988 |
| 1581.342773 | 0.986 |
| 1579.414307 | 0.985 |
| 1577.48584 | 0.983 |
| 1575.557373 | 0.981 |
| 1573.628906 | 0.979 |
| 1571.700439 | 0.977 |
| 1569.771973 | 0.975 |
| 1567.843506 | 0.973 |
| 1565.915039 | 0.972 |
| 1563.986572 | 0.97 |
| 1562.058105 | 0.969 |
| 1560.129639 | 0.968 |
| 1558.201172 | 0.966 |
| 1556.272705 | 0.965 |
| 1554.344238 | 0.964 |
| 1552.415771 | 0.963 |
| 1550.487305 | 0.962 |
| 1548.558838 | 0.962 |
| 1546.630371 | 0.962 |
| 1544.701904 | 0.961 |
| 1542.773438 | 0.961 |
| 1540.844971 | 0.961 |
| 1538.916504 | 0.961 |
| 1536.988037 | 0.961 |
| 1535.05957 | 0.961 |
| 1533.131104 | 0.961 |
| 1531.202637 | 0.961 |
| 1529.27417 | 0.961 |
| 1527.345703 | 0.962 |
| 1525.417236 | 0.962 |
| 1523.48877 | 0.962 |
| 1521.560303 | 0.962 |
| 1519.631836 | 0.962 |
| 1517.703369 | 0.962 |
| 1515.774902 | 0.962 |
| 1513.846436 | 0.963 |
| 1511.917969 | 0.964 |
| 1509.989502 | 0.965 |
| 1508.061035 | 0.966 |
| 1506.132568 | 0.967 |
| 1504.204102 | 0.969 |
| 1502.275635 | 0.97 |
| 1500.347168 | 0.972 |
| 1498.418701 | 0.973 |
| 1496.490234 | 0.975 |
| 1494.561768 | 0.977 |
| 1492.633301 | 0.978 |
| 1490.704834 | 0.979 |
| 1488.776367 | 0.98 |
| 1486.8479 | 0.981 |
| 1484.919434 | 0.982 |
| 1482.990967 | 0.982 |
| 1481.0625 | 0.982 |
| 1479.134033 | 0.982 |
| 1477.205566 | 0.982 |
| 1475.2771 | 0.981 |
| 1473.348633 | 0.981 |
| 1471.420166 | 0.98 |
| 1469.491699 | 0.98 |
| 1467.563232 | 0.979 |
| 1465.634766 | 0.979 |
| 1463.706299 | 0.979 |
| 1461.777832 | 0.979 |
| 1459.849365 | 0.979 |
| 1457.920898 | 0.98 |
| 1455.992432 | 0.981 |
| 1454.063965 | 0.982 |
| 1452.135498 | 0.983 |
| 1450.207031 | 0.984 |
| 1448.278564 | 0.985 |
| 1446.350098 | 0.985 |
| 1444.421631 | 0.986 |
| 1442.493164 | 0.987 |
| 1440.564697 | 0.987 |
| 1438.63623 | 0.987 |
| 1436.707764 | 0.987 |
| 1434.779297 | 0.987 |
| 1432.85083 | 0.987 |
| 1430.922363 | 0.987 |
| 1428.993896 | 0.986 |
| 1427.06543 | 0.986 |
| 1425.136963 | 0.986 |
| 1423.208496 | 0.986 |
| 1421.280029 | 0.986 |
| 1419.351563 | 0.987 |
| 1417.423096 | 0.987 |
| 1415.494629 | 0.987 |
| 1413.566162 | 0.988 |
| 1411.637695 | 0.988 |
| 1409.709229 | 0.988 |
| 1407.780762 | 0.988 |
| 1405.852295 | 0.988 |
| 1403.923828 | 0.988 |
| 1401.995361 | 0.988 |
| 1400.066895 | 0.988 |
| 1398.138428 | 0.988 |
| 1396.209961 | 0.988 |
| 1394.281494 | 0.988 |
| 1392.353027 | 0.988 |
| 1390.424561 | 0.989 |
| 1388.496094 | 0.989 |
| 1386.567627 | 0.989 |
| 1384.63916 | 0.99 |
| 1382.710693 | 0.99 |
| 1380.782227 | 0.991 |
| 1378.85376 | 0.991 |
| 1376.925293 | 0.992 |
| 1374.996826 | 0.992 |
| 1373.068359 | 0.992 |
| 1371.139893 | 0.993 |
| 1369.211426 | 0.993 |
| 1367.282959 | 0.994 |
| 1365.354492 | 0.994 |
| 1363.426025 | 0.994 |
| 1361.497559 | 0.995 |
| 1359.569092 | 0.995 |
| 1357.640625 | 0.995 |
| 1355.712158 | 0.996 |
| 1353.783691 | 0.996 |
| 1351.855225 | 0.996 |
| 1349.926758 | 0.997 |
| 1347.998291 | 0.997 |
| 1346.069824 | 0.997 |
| 1344.141357 | 0.998 |
| 1342.212891 | 0.998 |
| 1340.284424 | 0.998 |
| 1338.355957 | 0.999 |
| 1336.42749 | 0.999 |
| 1334.499023 | 0.999 |
| 1332.570557 | 0.999 |
| 1330.64209 | 0.999 |
| 1328.713623 | 0.999 |
| 1326.785156 | 1 |
| 1324.856689 | 1 |
| 1322.928223 | 1 |
| 1320.999756 | 1 |
| 1319.071289 | 1 |
| 1317.142822 | 1 |
| 1315.214355 | 1 |
| 1313.285889 | 1 |
| 1311.357422 | 1 |
| 1309.428955 | 1 |
| 1307.500488 | 1.001 |
| 1305.572021 | 1.001 |
| 1303.643555 | 1.001 |
| 1301.715088 | 1.002 |
| 1299.786621 | 1.002 |
| 1297.858154 | 1.002 |
| 1295.929688 | 1.002 |
| 1294.001221 | 1.003 |
| 1292.072754 | 1.003 |
| 1290.144287 | 1.003 |
| 1288.21582 | 1.003 |
| 1286.287354 | 1.002 |
| 1284.358887 | 1.002 |
| 1282.43042 | 1.002 |
| 1280.501953 | 1.001 |
| 1278.573486 | 1.001 |
| 1276.64502 | 1.001 |
| 1274.716553 | 1 |
| 1272.788086 | 1 |
| 1270.859619 | 1 |
| 1268.931152 | 1 |
| 1267.002686 | 1 |
| 1265.074219 | 1 |
| 1263.145752 | 1 |
| 1261.217285 | 1 |
| 1259.288818 | 1 |
| 1257.360352 | 1 |
| 1255.431885 | 1 |
| 1253.503418 | 1 |
| 1251.574951 | 1 |
| 1249.646484 | 1 |
| 1247.718018 | 1 |
| 1245.789551 | 1 |
| 1243.861084 | 1 |
| 1241.932617 | 1 |
| 1240.00415 | 1 |
| 1238.075684 | 1 |
| 1236.147217 | 1 |
| 1234.21875 | 0.999 |
| 1232.290283 | 0.999 |
| 1230.361816 | 0.999 |
| 1228.43335 | 0.999 |
| 1226.504883 | 0.999 |
| 1224.576416 | 0.999 |
| 1222.647949 | 0.999 |
| 1220.719482 | 0.999 |
| 1218.791016 | 0.999 |
| 1216.862549 | 0.999 |
| 1214.934082 | 0.999 |
| 1213.005615 | 0.999 |
| 1211.077148 | 0.999 |
| 1209.148682 | 0.999 |
| 1207.220215 | 0.999 |
| 1205.291748 | 0.999 |
| 1203.363281 | 0.998 |
| 1201.434814 | 0.998 |
| 1199.506348 | 0.998 |
| 1197.577881 | 0.998 |
| 1195.649414 | 0.998 |
| 1193.720947 | 0.998 |
| 1191.79248 | 0.998 |
| 1189.864014 | 0.998 |
| 1187.935547 | 0.998 |
| 1186.00708 | 0.998 |
| 1184.078613 | 0.998 |
| 1182.150146 | 0.998 |
| 1180.22168 | 0.998 |
| 1178.293213 | 0.997 |
| 1176.364746 | 0.997 |
| 1174.436279 | 0.997 |
| 1172.507813 | 0.997 |
| 1170.579346 | 0.997 |
| 1168.650879 | 0.996 |
| 1166.722412 | 0.996 |
| 1164.793945 | 0.996 |
| 1162.865479 | 0.996 |
| 1160.937012 | 0.996 |
| 1159.008545 | 0.996 |
| 1157.080078 | 0.995 |
| 1155.151611 | 0.995 |
| 1153.223145 | 0.995 |
| 1151.294678 | 0.996 |
| 1149.366211 | 0.996 |
| 1147.437744 | 0.996 |
| 1145.509277 | 0.996 |
| 1143.580811 | 0.996 |
| 1141.652344 | 0.996 |
| 1139.723877 | 0.996 |
| 1137.79541 | 0.996 |
| 1135.866943 | 0.996 |
| 1133.938477 | 0.996 |
| 1132.01001 | 0.996 |
| 1130.081543 | 0.996 |
| 1128.153076 | 0.996 |
| 1126.224609 | 0.995 |
| 1124.296143 | 0.995 |
| 1122.367676 | 0.995 |
| 1120.439209 | 0.995 |
| 1118.510742 | 0.995 |
| 1116.582275 | 0.994 |
| 1114.653809 | 0.994 |
| 1112.725342 | 0.994 |
| 1110.796875 | 0.994 |
| 1108.868408 | 0.994 |
| 1106.939941 | 0.994 |
| 1105.011475 | 0.995 |
| 1103.083008 | 0.995 |
| 1101.154541 | 0.995 |
| 1099.226074 | 0.995 |
| 1097.297607 | 0.995 |
| 1095.369141 | 0.995 |
| 1093.440674 | 0.995 |
| 1091.512207 | 0.995 |
| 1089.58374 | 0.995 |
| 1087.655273 | 0.995 |
| 1085.726807 | 0.995 |
| 1083.79834 | 0.995 |
| 1081.869873 | 0.995 |
| 1079.941406 | 0.995 |
| 1078.012939 | 0.995 |
| 1076.084473 | 0.995 |
| 1074.156006 | 0.995 |
| 1072.227539 | 0.995 |
| 1070.299072 | 0.996 |
| 1068.370605 | 0.996 |
| 1066.442139 | 0.996 |
| 1064.513672 | 0.996 |
| 1062.585205 | 0.996 |
| 1060.656738 | 0.996 |
| 1058.728271 | 0.996 |
| 1056.799805 | 0.996 |
| 1054.871338 | 0.996 |
| 1052.942871 | 0.996 |
| 1051.014404 | 0.996 |
| 1049.085938 | 0.995 |
| 1047.157471 | 0.995 |
| 1045.229004 | 0.995 |
| 1043.300537 | 0.995 |
| 1041.37207 | 0.995 |
| 1039.443604 | 0.995 |
| 1037.515137 | 0.995 |
| 1035.58667 | 0.995 |
| 1033.658203 | 0.995 |
| 1031.729736 | 0.996 |
| 1029.80127 | 0.996 |
| 1027.872803 | 0.996 |
| 1025.944336 | 0.996 |
| 1024.015869 | 0.997 |
| 1022.087402 | 0.997 |
| 1020.158936 | 0.997 |
| 1018.230469 | 0.997 |
| 1016.302002 | 0.998 |
| 1014.373535 | 0.998 |
| 1012.445068 | 0.998 |
| 1010.516602 | 0.998 |
| 1008.588135 | 0.998 |
| 1006.659668 | 0.998 |
| 1004.731201 | 0.998 |
| 1002.802734 | 0.998 |
| 1000.874268 | 0.997 |
| 998.945801 | 0.998 |
| 997.017334 | 0.998 |
| 995.088867 | 0.998 |
| 993.1604 | 0.998 |
| 991.231934 | 0.998 |
| 989.303467 | 0.998 |
| 987.375 | 0.999 |
| 985.446533 | 0.999 |
| 983.518066 | 1 |
| 981.5896 | 1 |
| 979.661133 | 1 |
| 977.732666 | 1 |
| 975.804199 | 1 |
| 973.875732 | 1.001 |
| 971.947266 | 1 |
| 970.018799 | 1 |
| 968.090332 | 1 |
| 966.161865 | 1 |
| 964.233398 | 1 |
| 962.304932 | 1 |
| 960.376465 | 1 |
| 958.447998 | 0.999 |
| 956.519531 | 0.999 |
| 954.591064 | 0.999 |
| 952.662598 | 0.999 |
| 950.734131 | 0.999 |
| 948.805664 | 0.999 |
| 946.877197 | 0.999 |
| 944.94873 | 0.999 |
| 943.020264 | 0.999 |
| 941.091797 | 0.999 |
| 939.16333 | 0.999 |
| 937.234863 | 1 |
| 935.306396 | 1 |
| 933.37793 | 1 |
| 931.449463 | 1 |
| 929.520996 | 1 |
| 927.592529 | 1 |
| 925.664063 | 1 |
| 923.735596 | 1 |
| 921.807129 | 1 |
| 919.878662 | 1 |
| 917.950195 | 1 |
| 916.021729 | 0.999 |
| 914.093262 | 0.999 |
| 912.164795 | 0.999 |
| 910.236328 | 0.999 |
| 908.307861 | 0.998 |
| 906.379395 | 0.998 |
| 904.450928 | 0.998 |
| 902.522461 | 0.998 |
| 900.593994 | 0.997 |
| 898.665527 | 0.997 |
| 896.737061 | 0.997 |
| 894.808594 | 0.997 |
| 892.880127 | 0.997 |
| 890.95166 | 0.997 |
| 889.023193 | 0.997 |
| 887.094727 | 0.997 |
| 885.16626 | 0.998 |
| 883.237793 | 0.998 |
| 881.309326 | 0.998 |
| 879.380859 | 0.999 |
| 877.452393 | 0.999 |
| 875.523926 | 0.999 |
| 873.595459 | 1 |
| 871.666992 | 1 |
| 869.738525 | 1 |
| 867.810059 | 1 |
| 865.881592 | 1 |
| 863.953125 | 1 |
| 862.024658 | 1 |
| 860.096191 | 1 |
| 858.167725 | 0.999 |
| 856.239258 | 0.999 |
| 854.310791 | 0.999 |
| 852.382324 | 0.999 |
| 850.453857 | 0.998 |
| 848.525391 | 0.998 |
| 846.596924 | 0.998 |
| 844.668457 | 0.998 |
| 842.73999 | 0.998 |
| 840.811523 | 0.998 |
| 838.883057 | 0.998 |
| 836.95459 | 0.998 |
| 835.026123 | 0.999 |
| 833.097656 | 0.999 |
| 831.169189 | 0.999 |
| 829.240723 | 0.999 |
| 827.312256 | 1 |
| 825.383789 | 1 |
| 823.455322 | 1 |
| 821.526855 | 1 |
| 819.598389 | 1 |
| 817.669922 | 1 |
| 815.741455 | 1 |
| 813.812988 | 1 |
| 811.884521 | 1 |
| 809.956055 | 1 |
| 808.027588 | 1 |
| 806.099121 | 1 |
| 804.170654 | 1 |
| 802.242188 | 1 |
| 800.313721 | 1 |
| 798.385254 | 1 |
| 796.456787 | 1 |
| 794.52832 | 1 |
| 792.599854 | 1 |
| 790.671387 | 1 |
| 788.74292 | 1 |
| 786.814453 | 1 |
| 784.885986 | 0.999 |
| 782.95752 | 0.999 |
| 781.029053 | 0.999 |
| 779.100586 | 0.999 |
| 777.172119 | 0.999 |
| 775.243652 | 0.998 |
| 773.315186 | 0.998 |
| 771.386719 | 0.998 |
| 769.458252 | 0.998 |
| 767.529785 | 0.998 |
| 765.601318 | 0.998 |
| 763.672852 | 0.997 |
| 761.744385 | 0.997 |
| 759.815918 | 0.997 |
| 757.887451 | 0.997 |
| 755.958984 | 0.997 |
| 754.030518 | 0.997 |
| 752.102051 | 0.997 |
| 750.173584 | 0.997 |
| 748.245117 | 0.997 |
| 746.31665 | 0.997 |
| 744.388184 | 0.996 |
| 742.459717 | 0.996 |
| 740.53125 | 0.996 |
| 738.602783 | 0.996 |
| 736.674316 | 0.995 |
| 734.74585 | 0.995 |
| 732.817383 | 0.995 |
| 730.888916 | 0.994 |
| 728.960449 | 0.994 |
| 727.031982 | 0.994 |
| 725.103516 | 0.994 |
| 723.175049 | 0.994 |
| 721.246582 | 0.993 |
| 719.318115 | 0.993 |
| 717.389648 | 0.993 |
| 715.461182 | 0.993 |
| 713.532715 | 0.993 |
| 711.604248 | 0.993 |
| 709.675781 | 0.992 |
| 707.747314 | 0.992 |
| 705.818848 | 0.992 |
| 703.890381 | 0.991 |
| 701.961914 | 0.991 |
| 700.033447 | 0.99 |
| 698.10498 | 0.989 |
| 696.176514 | 0.988 |
| 694.248047 | 0.987 |
| 692.31958 | 0.986 |
| 690.391113 | 0.985 |
| 688.462646 | 0.984 |
| 686.53418 | 0.983 |
| 684.605713 | 0.982 |
| 682.677246 | 0.981 |
| 680.748779 | 0.98 |
| 678.820313 | 0.979 |
| 676.891846 | 0.978 |
| 674.963379 | 0.978 |
| 673.034912 | 0.977 |
| 671.106445 | 0.977 |
| 669.177979 | 0.977 |
| 667.249512 | 0.977 |
| 665.321045 | 0.977 |
| 663.392578 | 0.978 |
| 661.464111 | 0.979 |
| 659.535645 | 0.979 |
| 657.607178 | 0.98 |
| 655.678711 | 0.981 |
| 653.750244 | 0.981 |
| 651.821777 | 0.982 |
| 649.893311 | 0.983 |
| 647.964844 | 0.983 |
| 646.036377 | 0.984 |
| 644.10791 | 0.984 |
| 642.179443 | 0.985 |
| 640.250977 | 0.985 |
| 638.32251 | 0.985 |
| 636.394043 | 0.986 |
| 634.465576 | 0.986 |
| 632.537109 | 0.986 |
| 630.608643 | 0.986 |
| 628.680176 | 0.986 |
| 626.751709 | 0.986 |
| 624.823242 | 0.986 |
| 622.894775 | 0.986 |
| 620.966309 | 0.987 |
| 619.037842 | 0.987 |
| 617.109375 | 0.987 |
| 615.180908 | 0.987 |
| 613.252441 | 0.987 |
| 611.323975 | 0.987 |
| 609.395508 | 0.987 |
| 607.467041 | 0.987 |
| 605.538574 | 0.987 |
| 603.610107 | 0.987 |
| 601.681641 | 0.987 |
| 599.753174 | 0.987 |
| 597.824707 | 0.987 |
| 595.89624 | 0.987 |
| 593.967773 | 0.987 |
| 592.039307 | 0.987 |
| 590.11084 | 0.986 |
| 588.182373 | 0.986 |
| 586.253906 | 0.986 |
| 584.325439 | 0.986 |
| 582.396973 | 0.986 |
| 580.468506 | 0.986 |
| 578.540039 | 0.986 |
| 576.611572 | 0.987 |
| 574.683105 | 0.987 |
| 572.754639 | 0.987 |
| 570.826172 | 0.988 |
| 568.897705 | 0.988 |
| 566.969238 | 0.989 |
| 565.040771 | 0.989 |
| 563.112305 | 0.99 |
| 561.183838 | 0.99 |
| 559.255371 | 0.99 |
| 557.326904 | 0.991 |
| 555.398438 | 0.991 |
| 553.469971 | 0.991 |
| 551.541504 | 0.991 |
| 549.613037 | 0.992 |
| 547.68457 | 0.992 |
| 545.756104 | 0.992 |
| 543.827637 | 0.992 |
| 541.89917 | 0.992 |
| 539.970703 | 0.993 |
| 538.042236 | 0.993 |
| 536.11377 | 0.993 |
| 534.185303 | 0.994 |
| 532.256836 | 0.994 |
| 530.328369 | 0.994 |
| 528.399902 | 0.994 |
| 526.471436 | 0.995 |
| 524.542969 | 0.995 |
| 522.614502 | 0.995 |
| 520.686035 | 0.995 |
| 518.757568 | 0.995 |
| 516.829102 | 0.995 |
| 514.900635 | 0.995 |
| 512.972168 | 0.995 |
| 511.043701 | 0.995 |
| 509.115234 | 0.995 |
| 507.186768 | 0.995 |
| 505.258301 | 0.995 |
| 503.329834 | 0.995 |
| 501.401367 | 0.995 |
| 499.4729 | 0.995 |
| 497.544434 | 0.996 |
| 495.615967 | 0.996 |
| 493.6875 | 0.996 |
| 491.759033 | 0.997 |
| 489.830566 | 0.997 |
| 487.9021 | 0.998 |
| 485.973633 | 0.998 |
| 484.045166 | 0.999 |
| 482.116699 | 0.999 |
| 480.188232 | 1 |
| 478.259766 | 1 |
| 476.331299 | 1 |
| 474.402832 | 0.999 |
| 472.474365 | 0.999 |
| 470.545898 | 0.998 |
| 468.617432 | 0.997 |
| 466.688965 | 0.997 |
| 464.760498 | 0.996 |
| 462.832031 | 0.996 |
| 460.903564 | 0.996 |
| 458.975098 | 0.995 |
| 457.046631 | 0.995 |
| 455.118164 | 0.995 |
| 453.189697 | 0.995 |
| 451.26123 | 0.995 |
| 449.332764 | 0.995 |
| 447.404297 | 0.995 |
| 445.47583 | 0.995 |
| 443.547363 | 0.995 |
| 441.618896 | 0.996 |
| 439.69043 | 0.996 |
| 437.761963 | 0.996 |
| 435.833496 | 0.997 |
| 433.905029 | 0.997 |
| 431.976563 | 0.998 |
| 430.048096 | 0.999 |
| 428.119629 | 0.999 |
| 426.191162 | 0.999 |
| 424.262695 | 1 |
| 422.334229 | 1 |
| 420.405762 | 1 |
| 418.477295 | 1 |
| 416.548828 | 0.999 |
| 414.620361 | 0.998 |
| 412.691895 | 0.998 |
| 410.763428 | 0.997 |
| 408.834961 | 0.996 |
| 406.906494 | 0.995 |
| 404.978027 | 0.994 |
| 403.049561 | 0.994 |
| 401.121094 | 0.993 |
| 399.192627 | 0.992 |